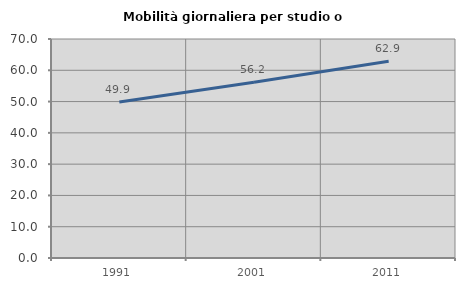
| Category | Mobilità giornaliera per studio o lavoro |
|---|---|
| 1991.0 | 49.893 |
| 2001.0 | 56.162 |
| 2011.0 | 62.86 |